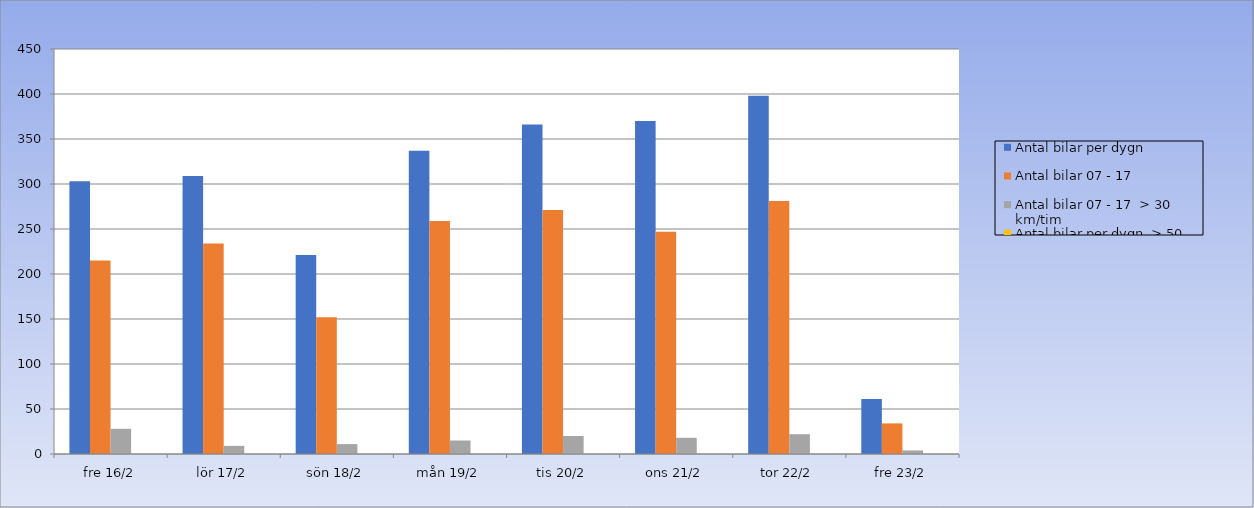
| Category | Antal bilar per dygn | Antal bilar 07 - 17 | Antal bilar 07 - 17  > 30 km/tim | Antal bilar per dygn  > 50 km/tim |
|---|---|---|---|---|
| fre 16/2 | 303 | 215 | 28 | 0 |
| lör 17/2 | 309 | 234 | 9 | 0 |
| sön 18/2 | 221 | 152 | 11 | 0 |
| mån 19/2 | 337 | 259 | 15 | 0 |
| tis 20/2 | 366 | 271 | 20 | 0 |
| ons 21/2 | 370 | 247 | 18 | 0 |
| tor 22/2 | 398 | 281 | 22 | 0 |
| fre 23/2 | 61 | 34 | 4 | 0 |